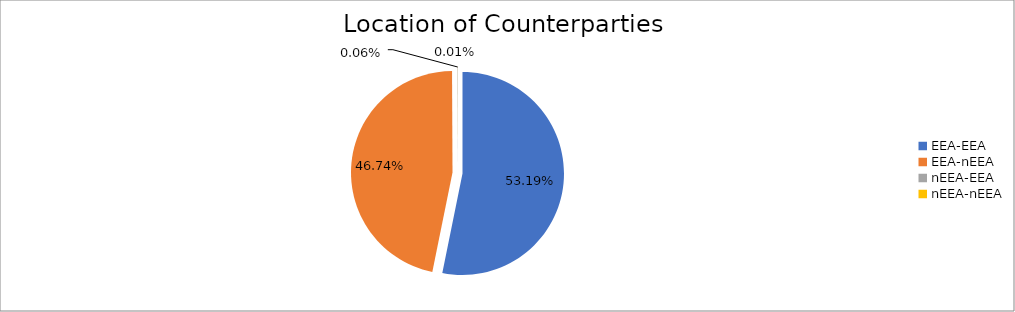
| Category | Series 0 |
|---|---|
| EEA-EEA | 6333753.234 |
| EEA-nEEA | 5565567.617 |
| nEEA-EEA | 7195.784 |
| nEEA-nEEA | 1536.081 |